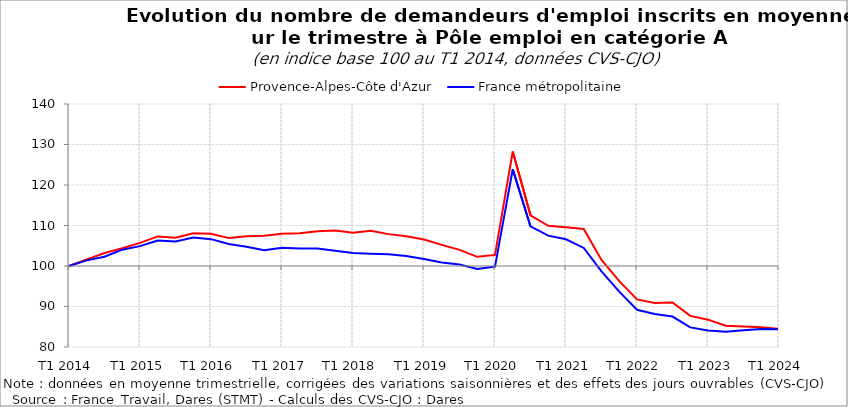
| Category | Provence-Alpes-Côte d'Azur | France métropolitaine |
|---|---|---|
| T1 2014 | 100 | 100 |
| T2 2014 | 101.619 | 101.388 |
| T3 2014 | 103.198 | 102.279 |
| T4 2014 | 104.372 | 104.035 |
| T1 2015 | 105.699 | 104.907 |
| T2 2015 | 107.305 | 106.296 |
| T3 2015 | 106.983 | 106.049 |
| T4 2015 | 108.081 | 107.021 |
| T1 2016 | 107.949 | 106.629 |
| T2 2016 | 106.887 | 105.456 |
| T3 2016 | 107.335 | 104.767 |
| T4 2016 | 107.481 | 103.869 |
| T1 2017 | 107.942 | 104.501 |
| T2 2017 | 108.094 | 104.345 |
| T3 2017 | 108.592 | 104.31 |
| T4 2017 | 108.745 | 103.792 |
| T1 2018 | 108.201 | 103.205 |
| T2 2018 | 108.698 | 103.025 |
| T3 2018 | 107.869 | 102.879 |
| T4 2018 | 107.331 | 102.458 |
| T1 2019 | 106.559 | 101.722 |
| T2 2019 | 105.225 | 100.853 |
| T3 2019 | 103.991 | 100.388 |
| T4 2019 | 102.269 | 99.28 |
| T1 2020 | 102.737 | 99.856 |
| T2 2020 | 128.268 | 123.878 |
| T3 2020 | 112.5 | 109.771 |
| T4 2020 | 109.916 | 107.501 |
| T1 2021 | 109.581 | 106.599 |
| T2 2021 | 109.123 | 104.452 |
| T3 2021 | 101.48 | 98.661 |
| T4 2021 | 96.248 | 93.667 |
| T1 2022 | 91.76 | 89.198 |
| T2 2022 | 90.894 | 88.162 |
| T3 2022 | 91.013 | 87.52 |
| T4 2022 | 87.676 | 84.838 |
| T1 2023 | 86.75 | 84.068 |
| T2 2023 | 85.238 | 83.756 |
| T3 2023 | 85.048 | 84.113 |
| T4 2023 | 84.883 | 84.47 |
| T1 2024 | 84.468 | 84.374 |